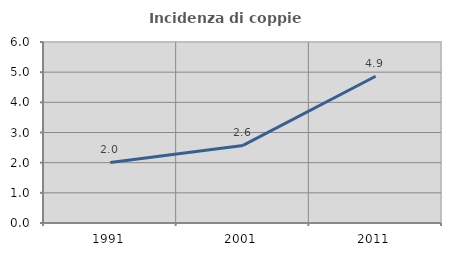
| Category | Incidenza di coppie miste |
|---|---|
| 1991.0 | 2.007 |
| 2001.0 | 2.572 |
| 2011.0 | 4.863 |